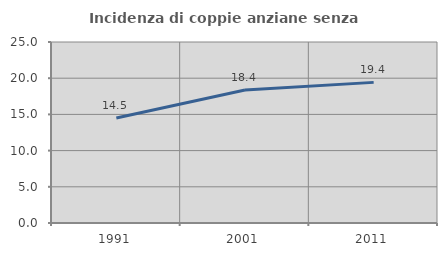
| Category | Incidenza di coppie anziane senza figli  |
|---|---|
| 1991.0 | 14.501 |
| 2001.0 | 18.358 |
| 2011.0 | 19.423 |